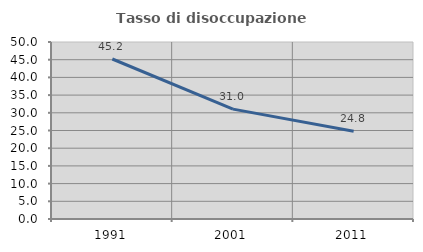
| Category | Tasso di disoccupazione giovanile  |
|---|---|
| 1991.0 | 45.2 |
| 2001.0 | 31.034 |
| 2011.0 | 24.779 |